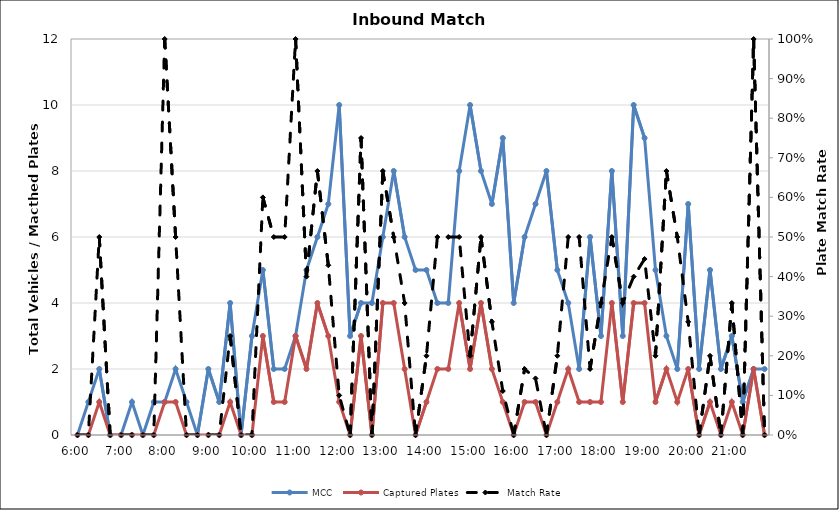
| Category | MCC | Captured Plates |
|---|---|---|
| 0.25 | 0 | 0 |
| 0.260416666666667 | 1 | 0 |
| 0.270833333333333 | 2 | 1 |
| 0.28125 | 0 | 0 |
| 0.291666666666667 | 0 | 0 |
| 0.302083333333333 | 1 | 0 |
| 0.3125 | 0 | 0 |
| 0.322916666666667 | 1 | 0 |
| 0.333333333333333 | 1 | 1 |
| 0.34375 | 2 | 1 |
| 0.354166666666667 | 1 | 0 |
| 0.364583333333333 | 0 | 0 |
| 0.375 | 2 | 0 |
| 0.385416666666667 | 1 | 0 |
| 0.395833333333333 | 4 | 1 |
| 0.40625 | 0 | 0 |
| 0.416666666666667 | 3 | 0 |
| 0.427083333333333 | 5 | 3 |
| 0.4375 | 2 | 1 |
| 0.447916666666667 | 2 | 1 |
| 0.458333333333333 | 3 | 3 |
| 0.46875 | 5 | 2 |
| 0.479166666666667 | 6 | 4 |
| 0.489583333333333 | 7 | 3 |
| 0.5 | 10 | 1 |
| 0.510416666666667 | 3 | 0 |
| 0.520833333333333 | 4 | 3 |
| 0.53125 | 4 | 0 |
| 0.541666666666667 | 6 | 4 |
| 0.552083333333333 | 8 | 4 |
| 0.5625 | 6 | 2 |
| 0.572916666666667 | 5 | 0 |
| 0.583333333333333 | 5 | 1 |
| 0.59375 | 4 | 2 |
| 0.604166666666667 | 4 | 2 |
| 0.614583333333333 | 8 | 4 |
| 0.625 | 10 | 2 |
| 0.635416666666667 | 8 | 4 |
| 0.645833333333333 | 7 | 2 |
| 0.65625 | 9 | 1 |
| 0.666666666666667 | 4 | 0 |
| 0.677083333333333 | 6 | 1 |
| 0.6875 | 7 | 1 |
| 0.697916666666667 | 8 | 0 |
| 0.708333333333333 | 5 | 1 |
| 0.71875 | 4 | 2 |
| 0.729166666666667 | 2 | 1 |
| 0.739583333333333 | 6 | 1 |
| 0.75 | 3 | 1 |
| 0.760416666666667 | 8 | 4 |
| 0.770833333333333 | 3 | 1 |
| 0.78125 | 10 | 4 |
| 0.791666666666667 | 9 | 4 |
| 0.802083333333333 | 5 | 1 |
| 0.8125 | 3 | 2 |
| 0.822916666666667 | 2 | 1 |
| 0.833333333333333 | 7 | 2 |
| 0.84375 | 2 | 0 |
| 0.854166666666667 | 5 | 1 |
| 0.864583333333333 | 2 | 0 |
| 0.875 | 3 | 1 |
| 0.885416666666667 | 1 | 0 |
| 0.895833333333333 | 2 | 2 |
| 0.90625 | 2 | 0 |